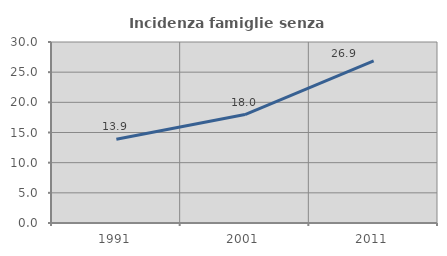
| Category | Incidenza famiglie senza nuclei |
|---|---|
| 1991.0 | 13.894 |
| 2001.0 | 17.972 |
| 2011.0 | 26.877 |